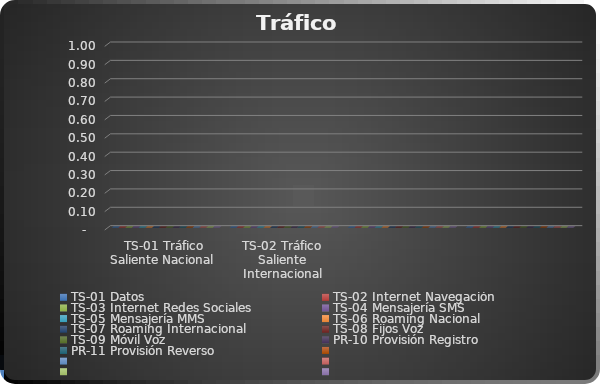
| Category | TS-01 Datos | TS-02 Internet Navegación | TS-03 Internet Redes Sociales | TS-04 Mensajería SMS | TS-05 Mensajería MMS | TS-06 Roaming Nacional | TS-07 Roaming Internacional | TS-08 Fijos Voz | TS-09 Móvil Voz | PR-10 Provisión Registro | PR-11 Provisión Reverso | Series 11 | Series 12 | Series 13 | Series 14 | Series 15 |
|---|---|---|---|---|---|---|---|---|---|---|---|---|---|---|---|---|
| TS-01 Tráfico Saliente Nacional  | 0 | 0 | 0 | 0 | 0 | 0 | 0 | 0 | 0 | 0 | 0 | 0 | 0 | 0 | 0 | 0 |
| TS-02 Tráfico Saliente Internacional | 0 | 0 | 0 | 0 | 0 | 0 | 0 | 0 | 0 | 0 | 0 | 0 | 0 | 0 | 0 | 0 |